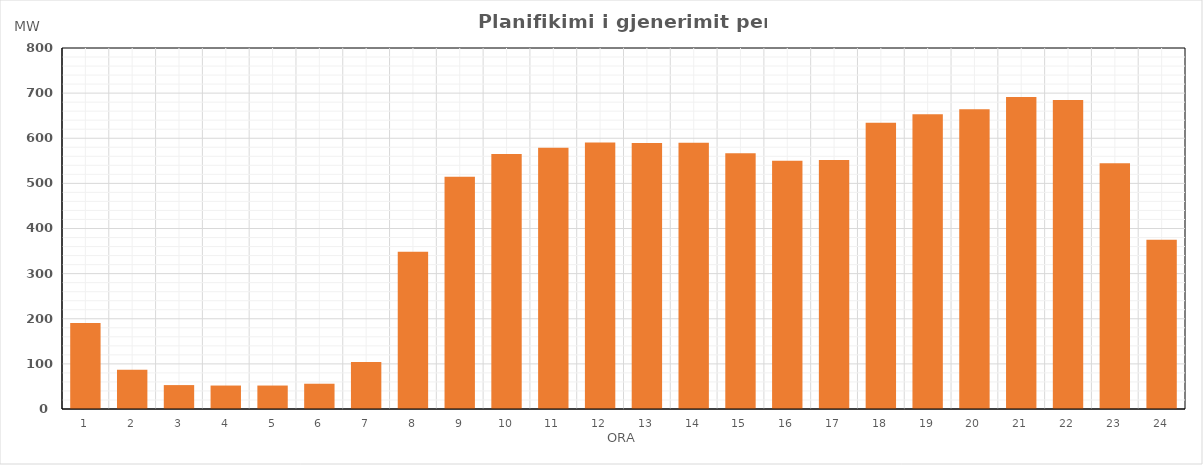
| Category | Max (MW) |
|---|---|
| 0 | 190.682 |
| 1 | 86.978 |
| 2 | 53 |
| 3 | 52 |
| 4 | 52 |
| 5 | 56 |
| 6 | 103.956 |
| 7 | 348.534 |
| 8 | 514.779 |
| 9 | 565.128 |
| 10 | 579.208 |
| 11 | 590.331 |
| 12 | 589.307 |
| 13 | 590.287 |
| 14 | 567 |
| 15 | 549.99 |
| 16 | 552.045 |
| 17 | 634.134 |
| 18 | 653.221 |
| 19 | 664.261 |
| 20 | 691.426 |
| 21 | 684.562 |
| 22 | 544.802 |
| 23 | 374.913 |